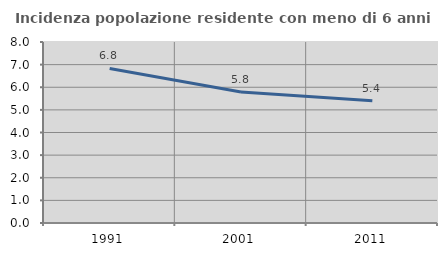
| Category | Incidenza popolazione residente con meno di 6 anni |
|---|---|
| 1991.0 | 6.829 |
| 2001.0 | 5.788 |
| 2011.0 | 5.402 |